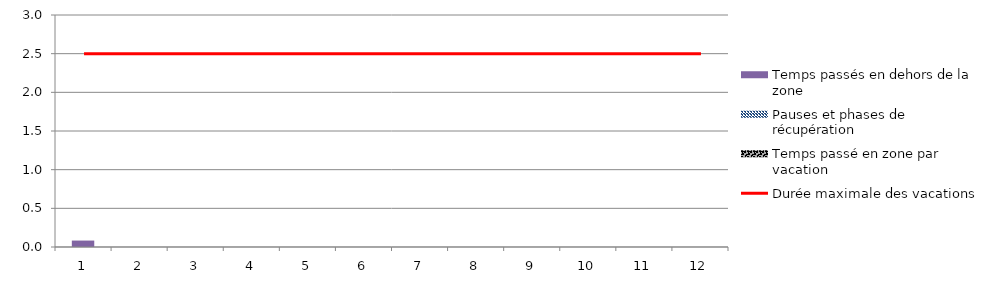
| Category | Temps passé en zone par vacation | Pauses et phases de récupération | Temps passés en dehors de la zone |
|---|---|---|---|
| 0 | 0 | 0 | 0.083 |
| 1 | 0 | 0 | 0 |
| 2 | 0 | 0 | 0 |
| 3 | 0 | 0 | 0 |
| 4 | 0 | 0 | 0 |
| 5 | 0 | 0 | 0 |
| 6 | 0 | 0 | 0 |
| 7 | 0 | 0 | 0 |
| 8 | 0 | 0 | 0 |
| 9 | 0 | 0 | 0 |
| 10 | 0 | 0 | 0 |
| 11 | 0 | 0 | 0 |